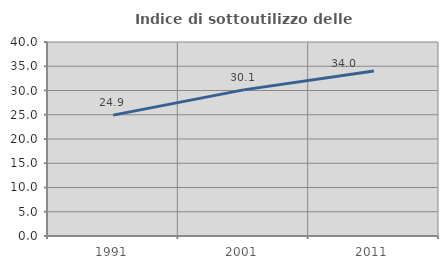
| Category | Indice di sottoutilizzo delle abitazioni  |
|---|---|
| 1991.0 | 24.928 |
| 2001.0 | 30.129 |
| 2011.0 | 34.021 |